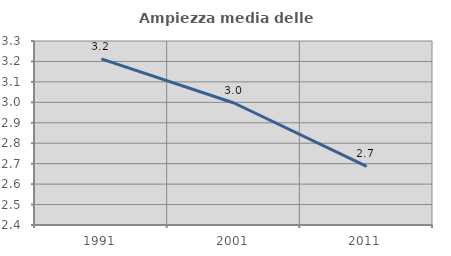
| Category | Ampiezza media delle famiglie |
|---|---|
| 1991.0 | 3.212 |
| 2001.0 | 2.997 |
| 2011.0 | 2.687 |